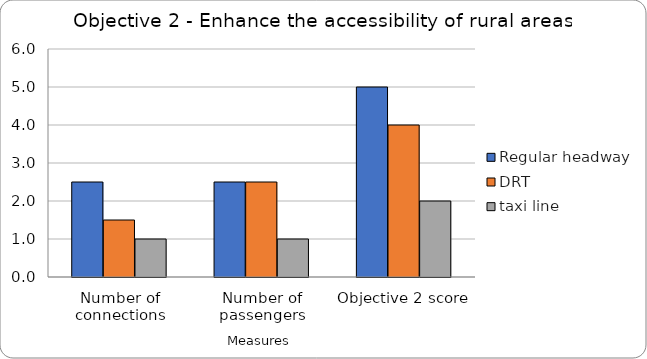
| Category | Regular headway | DRT | taxi line |
|---|---|---|---|
| Number of connections | 2.5 | 1.5 | 1 |
| Number of passengers | 2.5 | 2.5 | 1 |
| Objective 2 score | 5 | 4 | 2 |